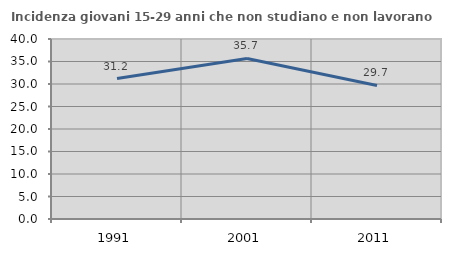
| Category | Incidenza giovani 15-29 anni che non studiano e non lavorano  |
|---|---|
| 1991.0 | 31.215 |
| 2001.0 | 35.676 |
| 2011.0 | 29.675 |